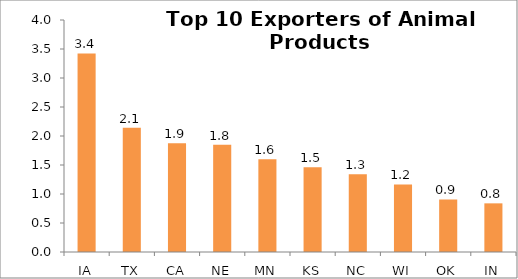
| Category | Animal Products |
|---|---|
| IA | 3.424 |
| TX | 2.143 |
| CA | 1.876 |
| NE | 1.848 |
| MN | 1.601 |
| KS | 1.46 |
| NC | 1.341 |
| WI | 1.166 |
| OK | 0.907 |
| IN | 0.839 |